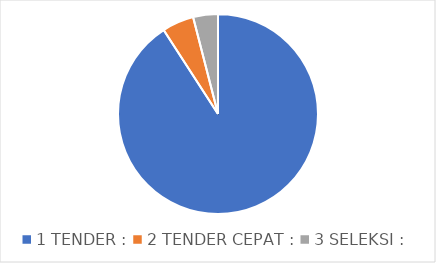
| Category | Series 0 |
|---|---|
| 0 | 159 |
| 1 | 9 |
| 2 | 7 |